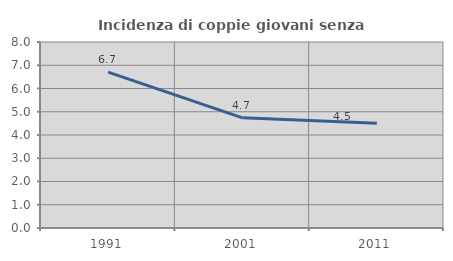
| Category | Incidenza di coppie giovani senza figli |
|---|---|
| 1991.0 | 6.701 |
| 2001.0 | 4.739 |
| 2011.0 | 4.505 |